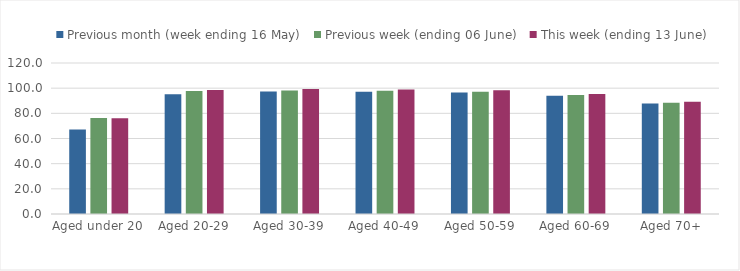
| Category | Previous month (week ending 16 May) | Previous week (ending 06 June) | This week (ending 13 June) |
|---|---|---|---|
| Aged under 20 | 67.158 | 76.38 | 76.123 |
| Aged 20-29 | 95.213 | 97.686 | 98.586 |
| Aged 30-39 | 97.291 | 98.203 | 99.322 |
| Aged 40-49 | 97.164 | 97.87 | 99.001 |
| Aged 50-59 | 96.484 | 97.237 | 98.249 |
| Aged 60-69 | 93.991 | 94.64 | 95.387 |
| Aged 70+ | 87.729 | 88.475 | 89.111 |